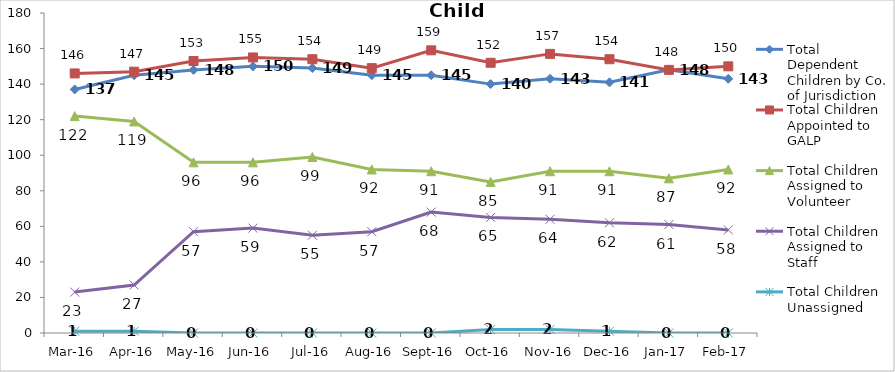
| Category | Total Dependent Children by Co. of Jurisdiction | Total Children Appointed to GALP | Total Children Assigned to Volunteer | Total Children Assigned to Staff | Total Children Unassigned |
|---|---|---|---|---|---|
| Mar-16 | 137 | 146 | 122 | 23 | 1 |
| Apr-16 | 145 | 147 | 119 | 27 | 1 |
| May-16 | 148 | 153 | 96 | 57 | 0 |
| Jun-16 | 150 | 155 | 96 | 59 | 0 |
| Jul-16 | 149 | 154 | 99 | 55 | 0 |
| Aug-16 | 145 | 149 | 92 | 57 | 0 |
| Sep-16 | 145 | 159 | 91 | 68 | 0 |
| Oct-16 | 140 | 152 | 85 | 65 | 2 |
| Nov-16 | 143 | 157 | 91 | 64 | 2 |
| Dec-16 | 141 | 154 | 91 | 62 | 1 |
| Jan-17 | 148 | 148 | 87 | 61 | 0 |
| Feb-17 | 143 | 150 | 92 | 58 | 0 |